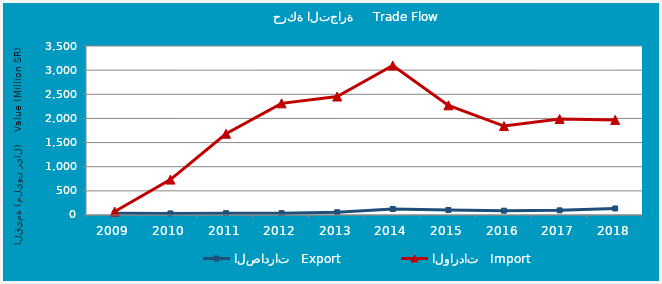
| Category | الصادرات   Export | الواردات   Import |
|---|---|---|
| 2009.0 | 35864734 | 71573537 |
| 2010.0 | 33076492 | 733086668 |
| 2011.0 | 38413509 | 1682372784 |
| 2012.0 | 38683513 | 2311903518 |
| 2013.0 | 57383230 | 2454383721 |
| 2014.0 | 124360867 | 3095665556 |
| 2015.0 | 103469891 | 2270946349 |
| 2016.0 | 89131733 | 1841772179 |
| 2017.0 | 96292360 | 1986562515 |
| 2018.0 | 135167970 | 1969222881 |